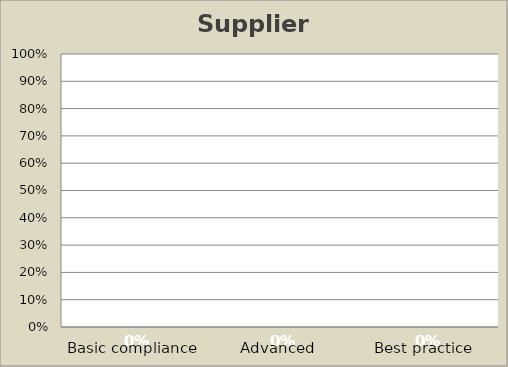
| Category | Supplier Capacities |
|---|---|
| Basic compliance | 0 |
| Advanced | 0 |
| Best practice | 0 |